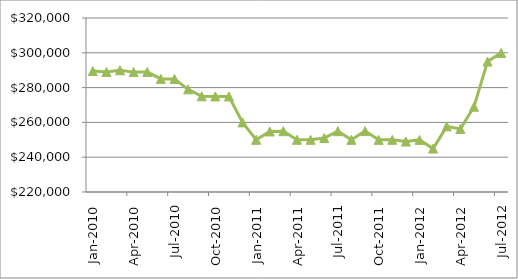
| Category | Series 2 |
|---|---|
| 2010-01-01 | 289500 |
| 2010-02-01 | 289000 |
| 2010-03-01 | 289950 |
| 2010-04-01 | 288900 |
| 2010-05-01 | 289000 |
| 2010-06-01 | 285000 |
| 2010-07-01 | 284965 |
| 2010-08-01 | 279000 |
| 2010-09-01 | 275000 |
| 2010-10-01 | 274950 |
| 2010-11-01 | 274900 |
| 2010-12-01 | 260000 |
| 2011-01-01 | 250000 |
| 2011-02-01 | 254805 |
| 2011-03-01 | 254950 |
| 2011-04-01 | 250000 |
| 2011-05-01 | 250000 |
| 2011-06-01 | 251000 |
| 2011-07-01 | 254950 |
| 2011-08-01 | 250000 |
| 2011-09-01 | 255000 |
| 2011-10-01 | 249970 |
| 2011-11-01 | 250000 |
| 2011-12-01 | 249000 |
| 2012-01-01 | 249950 |
| 2012-02-01 | 244950 |
| 2012-03-01 | 257725 |
| 2012-04-01 | 256225 |
| 2012-05-01 | 269000 |
| 2012-06-01 | 294950 |
| 2012-07-01 | 299950 |